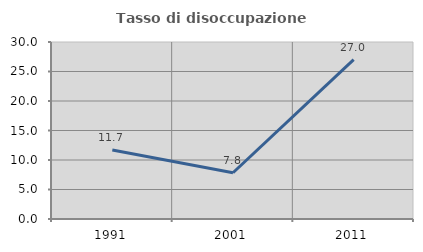
| Category | Tasso di disoccupazione giovanile  |
|---|---|
| 1991.0 | 11.688 |
| 2001.0 | 7.843 |
| 2011.0 | 27.027 |